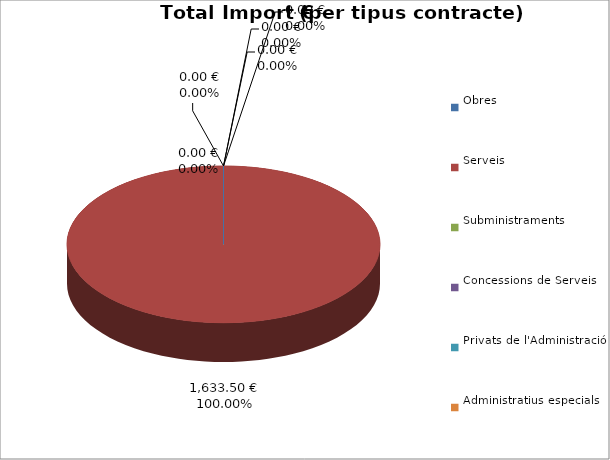
| Category | Total preu
(amb IVA) |
|---|---|
| Obres | 0 |
| Serveis | 1633.5 |
| Subministraments | 0 |
| Concessions de Serveis | 0 |
| Privats de l'Administració | 0 |
| Administratius especials | 0 |